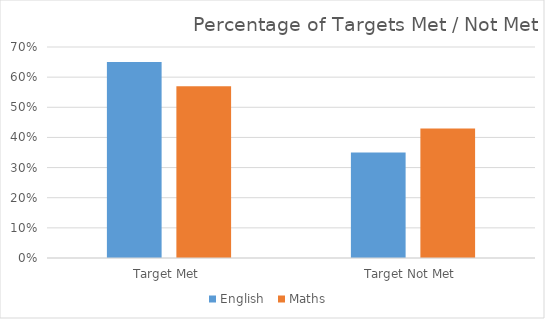
| Category | English  | Maths  |
|---|---|---|
| Target Met  | 0.65 | 0.57 |
| Target Not Met  | 0.35 | 0.43 |